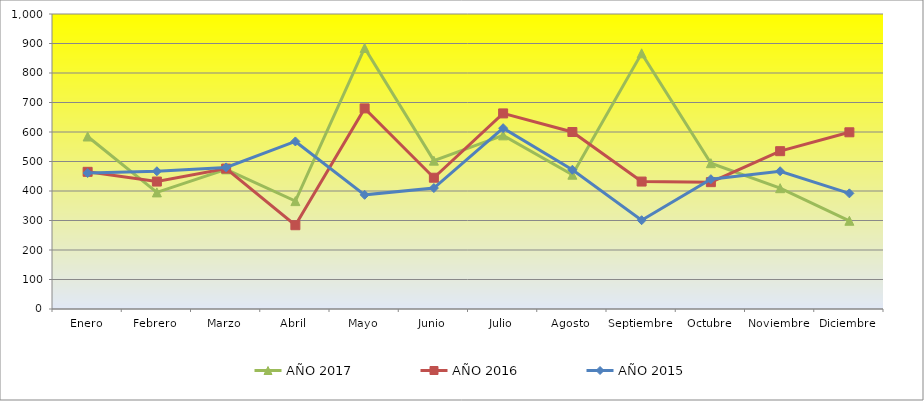
| Category | AÑO 2017 | AÑO 2016 | AÑO 2015 |
|---|---|---|---|
| Enero | 584.762 | 465 | 461 |
| Febrero | 395.238 | 432 | 467 |
| Marzo | 473.333 | 476 | 480 |
| Abril | 365.714 | 284 | 568 |
| Mayo | 884.762 | 680 | 387 |
| Junio | 502.857 | 445 | 410 |
| Julio | 588.571 | 663 | 613 |
| Agosto | 455.238 | 600 | 472 |
| Septiembre | 866.667 | 432 | 301 |
| Octubre | 494.286 | 430 | 440 |
| Noviembre | 409.524 | 535 | 467 |
| Diciembre | 299.048 | 599 | 392 |